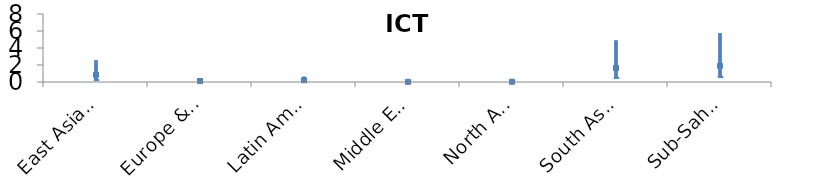
| Category | Worst | Best | Central |
|---|---|---|---|
| East Asia & Pacific | 2.551 | 0.283 | 0.85 |
| Europe & Central Asia | 0.338 | 0.038 | 0.113 |
| Latin America & Caribbean | 0.62 | 0.069 | 0.207 |
| Middle East & North Africa | 0.052 | 0.006 | 0.017 |
| North America | 0.091 | 0.01 | 0.03 |
| South Asia | 4.882 | 0.542 | 1.627 |
| Sub-Saharan Africa | 5.733 | 0.637 | 1.911 |